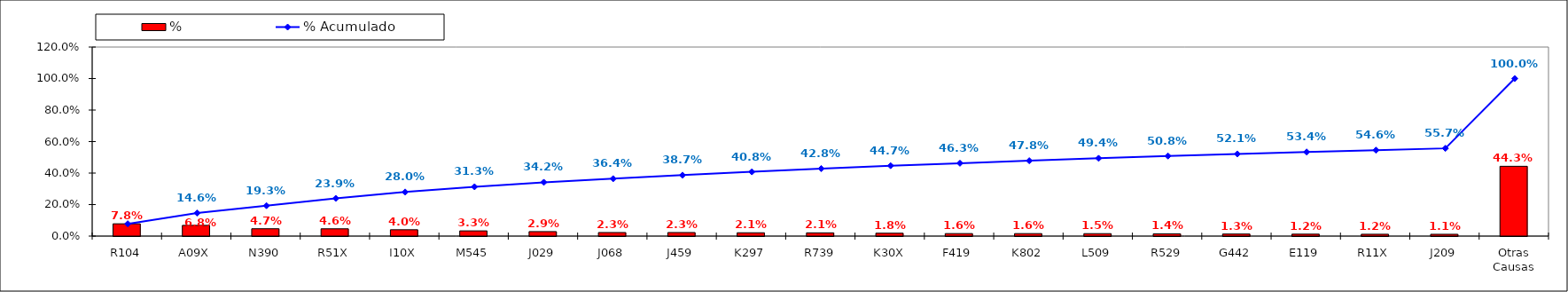
| Category | % |
|---|---|
| R104 | 0.078 |
| A09X | 0.068 |
| N390 | 0.047 |
| R51X | 0.046 |
| I10X | 0.04 |
| M545 | 0.033 |
| J029 | 0.029 |
| J068 | 0.023 |
| J459 | 0.023 |
| K297 | 0.021 |
| R739 | 0.021 |
| K30X | 0.018 |
| F419 | 0.016 |
| K802 | 0.016 |
| L509 | 0.015 |
| R529 | 0.014 |
| G442 | 0.013 |
| E119 | 0.012 |
| R11X | 0.012 |
| J209 | 0.011 |
| Otras Causas | 0.443 |